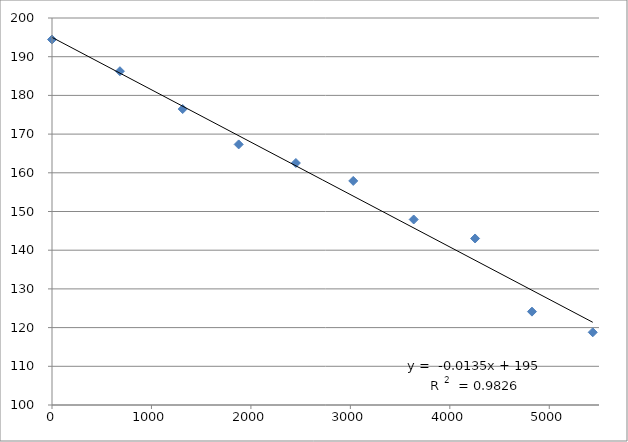
| Category | Series 0 |
|---|---|
| 0.0 | 194.448 |
| 682.9999999999949 | 186.253 |
| 1314.0000000000039 | 176.473 |
| 1876.9999999999993 | 167.335 |
| 2452.000000000006 | 162.531 |
| 3028.9999999999973 | 157.898 |
| 3636.9999999999995 | 147.933 |
| 4254.000000000003 | 143.031 |
| 4826.0 | 124.127 |
| 5437.000000000002 | 118.784 |